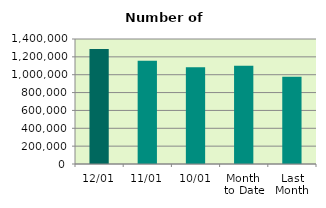
| Category | Series 0 |
|---|---|
| 12/01 | 1287608 |
| 11/01 | 1155182 |
| 10/01 | 1083842 |
| Month 
to Date | 1100991.333 |
| Last
Month | 976608.095 |